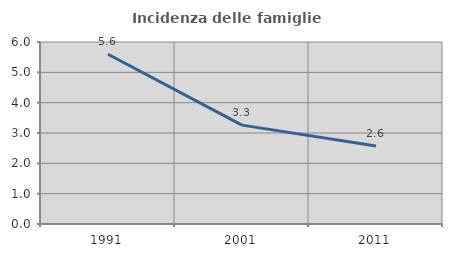
| Category | Incidenza delle famiglie numerose |
|---|---|
| 1991.0 | 5.596 |
| 2001.0 | 3.259 |
| 2011.0 | 2.575 |